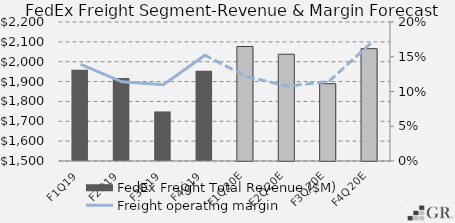
| Category | FedEx Freight Total Revenue ($M) |
|---|---|
|  F1Q19  | 1959.025 |
|  F2Q19  | 1917.798 |
|  F3Q19  | 1749.668 |
|  F4Q19  | 1954.816 |
|  F1Q20E  | 2076.811 |
|  F2Q20E  | 2037.673 |
|  F3Q20E  | 1889.568 |
|  F4Q20E  | 2065.629 |